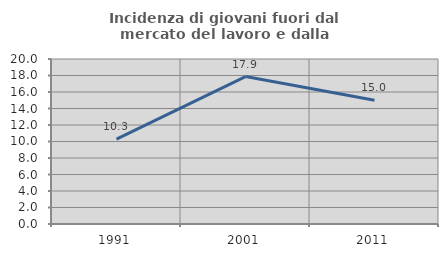
| Category | Incidenza di giovani fuori dal mercato del lavoro e dalla formazione  |
|---|---|
| 1991.0 | 10.289 |
| 2001.0 | 17.872 |
| 2011.0 | 14.996 |